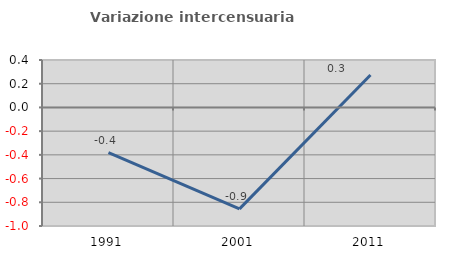
| Category | Variazione intercensuaria annua |
|---|---|
| 1991.0 | -0.381 |
| 2001.0 | -0.855 |
| 2011.0 | 0.273 |